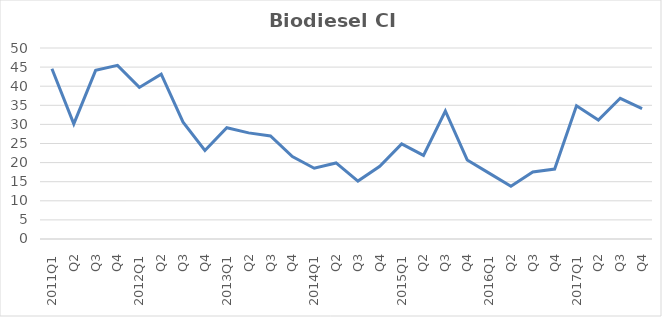
| Category | Biodiesel CI Avg |
|---|---|
| 2011Q1 | 44.57 |
| Q2 | 30.14 |
| Q3 | 44.16 |
| Q4 | 45.45 |
| 2012Q1 | 39.68 |
| Q2 | 43.15 |
| Q3 | 30.58 |
| Q4 | 23.16 |
| 2013Q1 | 29.14 |
| Q2 | 27.78 |
| Q3 | 26.97 |
| Q4 | 21.59 |
| 2014Q1 | 18.52 |
| Q2 | 19.91 |
| Q3 | 15.16 |
| Q4 | 19.04 |
| 2015Q1 | 24.88 |
| Q2 | 21.9 |
| Q3 | 33.51 |
| Q4 | 20.7 |
| 2016Q1 | 17.25 |
| Q2 | 13.83 |
| Q3 | 17.53 |
| Q4 | 18.31 |
| 2017Q1 | 34.86 |
| Q2 | 31.16 |
| Q3 | 36.84 |
| Q4 | 34.15 |